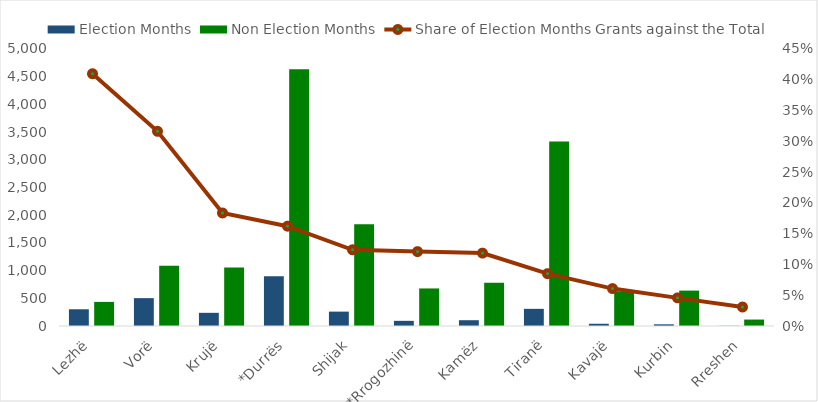
| Category | Election Months | Non Election Months |
|---|---|---|
| Lezhë | 302.088 | 435.103 |
| Vorë | 502.766 | 1086.81 |
| Krujë | 237.763 | 1057.328 |
| *Durrës | 897.468 | 4636.664 |
| Shijak | 259.642 | 1837.519 |
| *Rrogozhinë | 93.198 | 677.9 |
| Kamëz | 104.558 | 778.486 |
| Tiranë | 309.685 | 3332.322 |
| Kavajë | 40.537 | 626.402 |
| Kurbin | 30.603 | 639.164 |
| Rreshen | 3.697 | 116.266 |